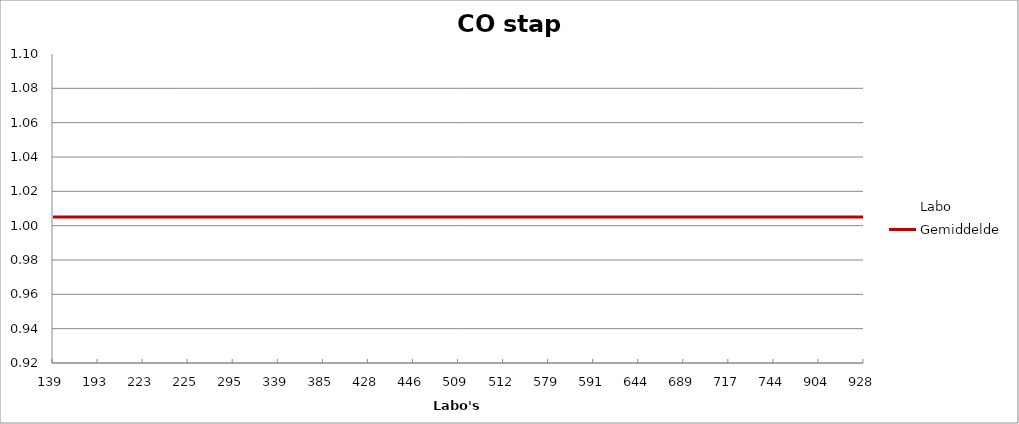
| Category | Labo | Gemiddelde |
|---|---|---|
| 139.0 | 1.009 | 1.005 |
| 193.0 | 1.077 | 1.005 |
| 223.0 | 1.015 | 1.005 |
| 225.0 | 1.026 | 1.005 |
| 295.0 | 0.975 | 1.005 |
| 339.0 | 1.015 | 1.005 |
| 385.0 | 0.992 | 1.005 |
| 428.0 | 0.998 | 1.005 |
| 446.0 | 1.02 | 1.005 |
| 509.0 | 1.015 | 1.005 |
| 512.0 | 0.992 | 1.005 |
| 579.0 | 1.032 | 1.005 |
| 591.0 | 0.986 | 1.005 |
| 644.0 | 0.998 | 1.005 |
| 689.0 | 1.015 | 1.005 |
| 717.0 | 0.975 | 1.005 |
| 744.0 | 0.998 | 1.005 |
| 904.0 | 1.026 | 1.005 |
| 928.0 | 0.97 | 1.005 |